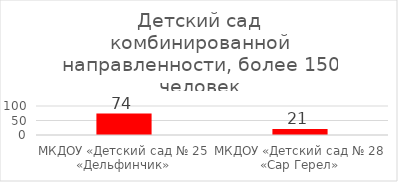
| Category | ИТОГО |
|---|---|
| МКДОУ «Детский сад № 25 «Дельфинчик» | 74 |
| МКДОУ «Детский сад № 28 «Сар Герел» | 21 |